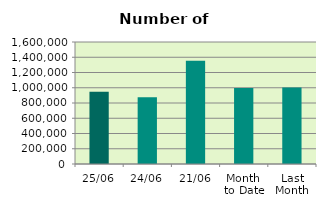
| Category | Series 0 |
|---|---|
| 25/06 | 947808 |
| 24/06 | 876858 |
| 21/06 | 1352710 |
| Month 
to Date | 996044.353 |
| Last
Month | 1004730.273 |